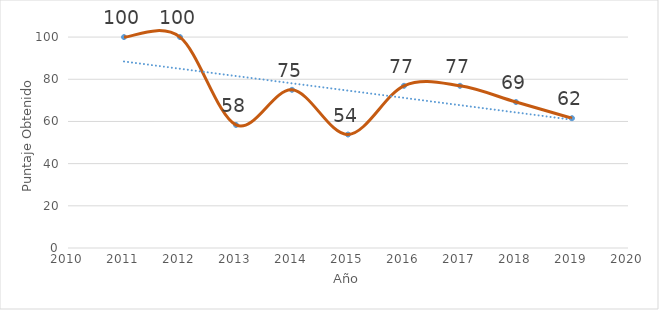
| Category | Contratación administrativa |
|---|---|
| 2011.0 | 100 |
| 2012.0 | 100 |
| 2013.0 | 58.33 |
| 2014.0 | 75 |
| 2015.0 | 53.8 |
| 2016.0 | 76.9 |
| 2017.0 | 76.9 |
| 2018.0 | 69.2 |
| 2019.0 | 61.538 |